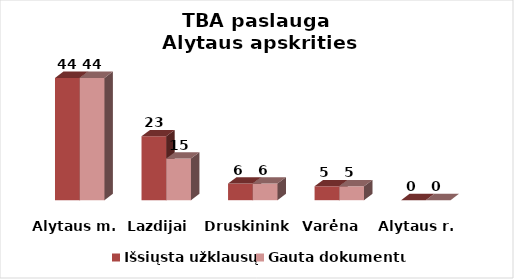
| Category | Išsiųsta užklausų | Gauta dokumentų |
|---|---|---|
| Alytaus m. | 44 | 44 |
| Lazdijai | 23 | 15 |
| Druskininkai | 6 | 6 |
| Varėna | 5 | 5 |
| Alytaus r. | 0 | 0 |